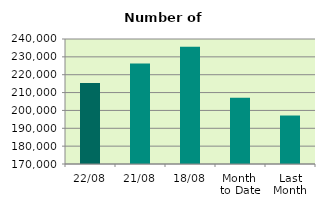
| Category | Series 0 |
|---|---|
| 22/08 | 215298 |
| 21/08 | 226274 |
| 18/08 | 235626 |
| Month 
to Date | 207045.375 |
| Last
Month | 197154 |